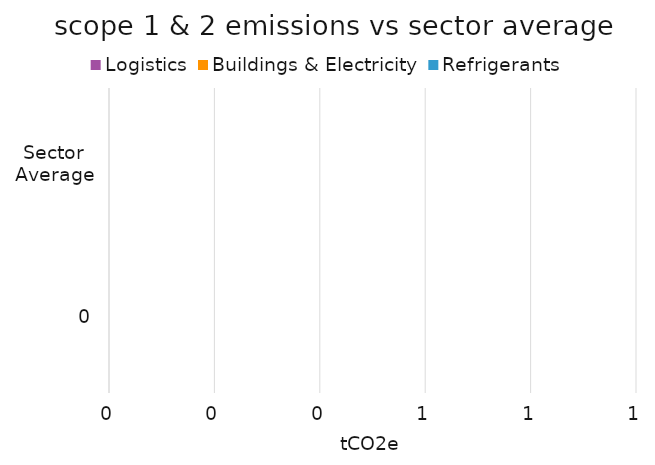
| Category | Logistics | Buildings & Electricity | Refrigerants |
|---|---|---|---|
| 0 | 0 | 0 | 0 |
| Sector Average | 0 | 0 | 0 |